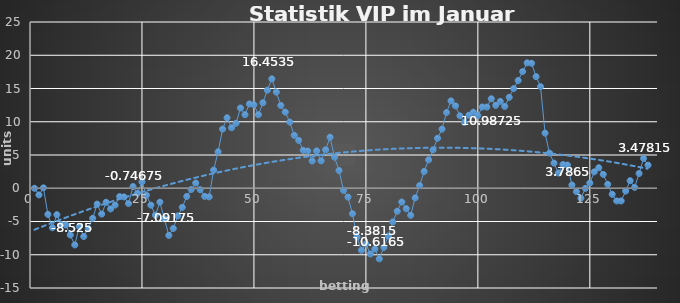
| Category | Series 0 |
|---|---|
| 0 | 0 |
| 1 | -1 |
| 2 | 0.065 |
| 3 | -3.935 |
| 4 | -5.935 |
| 5 | -3.975 |
| 6 | -5.475 |
| 7 | -5.525 |
| 8 | -7.025 |
| 9 | -8.525 |
| 10 | -5.754 |
| 11 | -7.254 |
| 12 | -6.046 |
| 13 | -4.516 |
| 14 | -2.385 |
| 15 | -3.885 |
| 16 | -2.11 |
| 17 | -3.11 |
| 18 | -2.533 |
| 19 | -1.254 |
| 20 | -1.304 |
| 21 | -2.304 |
| 22 | 0.253 |
| 23 | -0.747 |
| 24 | 0.958 |
| 25 | -1.042 |
| 26 | -2.542 |
| 27 | -4.042 |
| 28 | -2.092 |
| 29 | -4.592 |
| 30 | -7.092 |
| 31 | -6.052 |
| 32 | -4.152 |
| 33 | -2.873 |
| 34 | -1.238 |
| 35 | -0.188 |
| 36 | 0.782 |
| 37 | -0.218 |
| 38 | -1.218 |
| 39 | -1.293 |
| 40 | 2.732 |
| 41 | 5.482 |
| 42 | 8.892 |
| 43 | 10.597 |
| 44 | 9.097 |
| 45 | 9.772 |
| 46 | 12.066 |
| 47 | 11.066 |
| 48 | 12.678 |
| 49 | 12.553 |
| 50 | 11.053 |
| 51 | 12.853 |
| 52 | 14.748 |
| 53 | 16.453 |
| 54 | 14.453 |
| 55 | 12.453 |
| 56 | 11.453 |
| 57 | 9.953 |
| 58 | 7.953 |
| 59 | 7.203 |
| 60 | 5.703 |
| 61 | 5.603 |
| 62 | 4.103 |
| 63 | 5.618 |
| 64 | 4.118 |
| 65 | 5.776 |
| 66 | 7.671 |
| 67 | 4.671 |
| 68 | 2.671 |
| 69 | -0.329 |
| 70 | -1.329 |
| 71 | -3.829 |
| 72 | -7.329 |
| 73 | -9.329 |
| 74 | -8.382 |
| 75 | -9.882 |
| 76 | -9.117 |
| 77 | -10.617 |
| 78 | -8.892 |
| 79 | -7.192 |
| 80 | -5.062 |
| 81 | -3.457 |
| 82 | -2.071 |
| 83 | -3.071 |
| 84 | -4.071 |
| 85 | -1.442 |
| 86 | 0.408 |
| 87 | 2.52 |
| 88 | 4.273 |
| 89 | 5.765 |
| 90 | 7.518 |
| 91 | 8.898 |
| 92 | 11.384 |
| 93 | 13.137 |
| 94 | 12.387 |
| 95 | 10.887 |
| 96 | 9.887 |
| 97 | 10.987 |
| 98 | 11.437 |
| 99 | 10.937 |
| 100 | 12.216 |
| 101 | 12.216 |
| 102 | 13.459 |
| 103 | 12.459 |
| 104 | 13.061 |
| 105 | 12.311 |
| 106 | 13.675 |
| 107 | 14.99 |
| 108 | 16.197 |
| 109 | 17.547 |
| 110 | 18.861 |
| 111 | 18.786 |
| 112 | 16.786 |
| 113 | 15.286 |
| 114 | 8.286 |
| 115 | 5.286 |
| 116 | 3.786 |
| 117 | 2.286 |
| 118 | 3.565 |
| 119 | 3.49 |
| 120 | 0.49 |
| 121 | -0.51 |
| 122 | -1.51 |
| 123 | -0.017 |
| 124 | 0.788 |
| 125 | 2.468 |
| 126 | 3.088 |
| 127 | 2.088 |
| 128 | 0.588 |
| 129 | -0.912 |
| 130 | -1.912 |
| 131 | -1.912 |
| 132 | -0.427 |
| 133 | 1.133 |
| 134 | 0.133 |
| 135 | 2.218 |
| 136 | 4.478 |
| 137 | 3.478 |